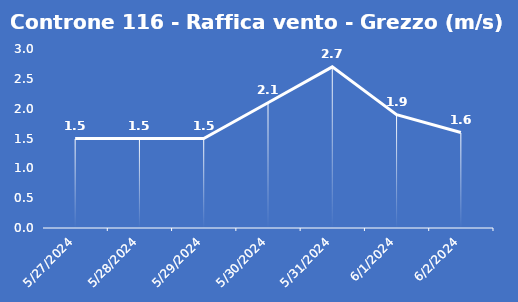
| Category | Controne 116 - Raffica vento - Grezzo (m/s) |
|---|---|
| 5/27/24 | 1.5 |
| 5/28/24 | 1.5 |
| 5/29/24 | 1.5 |
| 5/30/24 | 2.1 |
| 5/31/24 | 2.7 |
| 6/1/24 | 1.9 |
| 6/2/24 | 1.6 |